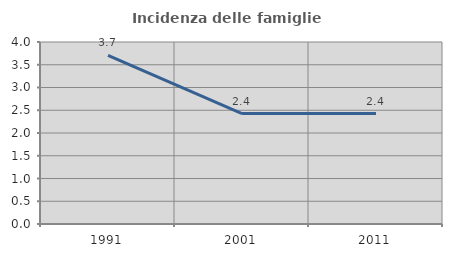
| Category | Incidenza delle famiglie numerose |
|---|---|
| 1991.0 | 3.707 |
| 2001.0 | 2.426 |
| 2011.0 | 2.427 |